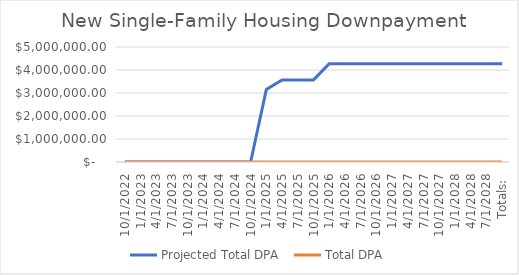
| Category | Projected Total DPA  | Total DPA |
|---|---|---|
| 10/1/2022 | 0 | 0 |
| 1/1/2023 | 0 | 0 |
| 4/1/2023 | 0 | 0 |
| 7/1/2023 | 0 | 0 |
| 10/1/2023 | 0 | 0 |
| 1/1/2024 | 0 | 0 |
| 4/1/2024 | 0 | 0 |
| 7/1/2024 | 0 | 0 |
| 10/1/2024 | 0 | 0 |
| 1/1/2025 | 3150000 | 0 |
| 4/1/2025 | 3570000 | 0 |
| 7/1/2025 | 3570000 | 0 |
| 10/1/2025 | 3570000 | 0 |
| 1/1/2026 | 4270000 | 0 |
| 4/1/2026 | 4270000 | 0 |
| 7/1/2026 | 4270000 | 0 |
| 10/1/2026 | 4270000 | 0 |
| 1/1/2027 | 4270000 | 0 |
| 4/1/2027 | 4270000 | 0 |
| 7/1/2027 | 4270000 | 0 |
| 10/1/2027 | 4270000 | 0 |
| 1/1/2028 | 4270000 | 0 |
| 4/1/2028 | 4270000 | 0 |
| 7/1/2028 | 4270000 | 0 |
| Totals:  | 4270000 | 0 |